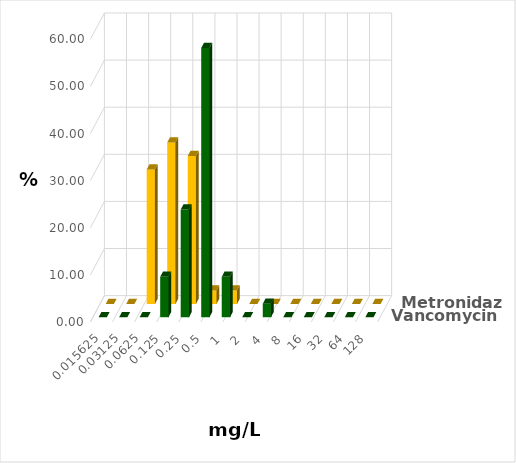
| Category | Vancomycin | Metronidazol |
|---|---|---|
| 0.015625 | 0 | 0 |
| 0.03125 | 0 | 0 |
| 0.0625 | 0 | 28.571 |
| 0.125 | 8.571 | 34.286 |
| 0.25 | 22.857 | 31.429 |
| 0.5 | 57.143 | 2.857 |
| 1.0 | 8.571 | 2.857 |
| 2.0 | 0 | 0 |
| 4.0 | 2.857 | 0 |
| 8.0 | 0 | 0 |
| 16.0 | 0 | 0 |
| 32.0 | 0 | 0 |
| 64.0 | 0 | 0 |
| 128.0 | 0 | 0 |